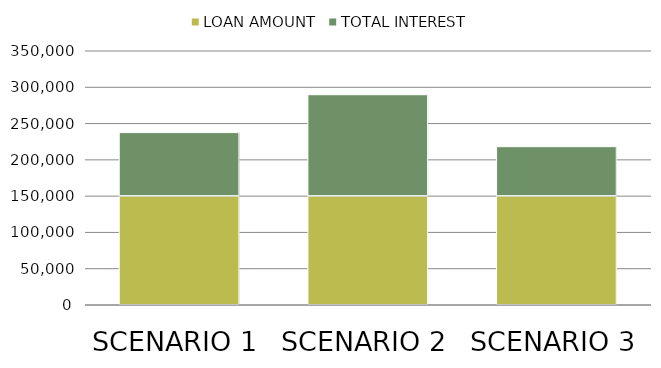
| Category | LOAN AMOUNT | TOTAL INTEREST |
|---|---|---|
| SCENARIO 1 | 150000 | 87584.066 |
| SCENARIO 2 | 150000 | 139753.762 |
| SCENARIO 3 | 150000 | 68152.919 |